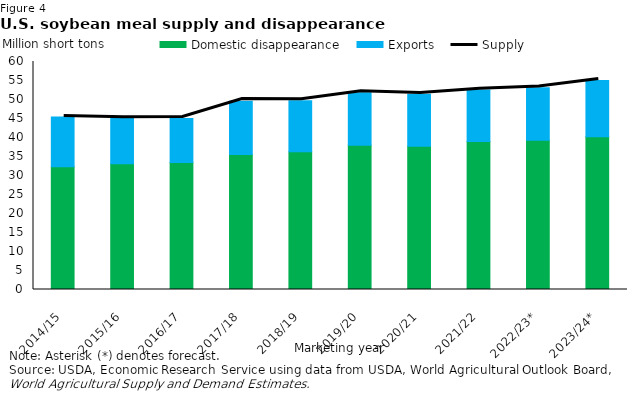
| Category | Domestic disappearance | Exports |
|---|---|---|
| 2014/15 | 32.278 | 13.107 |
| 2015/16 | 33.11 | 11.953 |
| 2016/17 | 33.416 | 11.58 |
| 2017/18 | 35.535 | 14.018 |
| 2018/19 | 36.268 | 13.383 |
| 2019/20 | 37.967 | 13.833 |
| 2020/21 | 37.674 | 13.675 |
| 2021/22 | 38.97 | 13.524 |
| 2022/23* | 39.3 | 13.8 |
| 2023/24* | 40.175 | 14.8 |